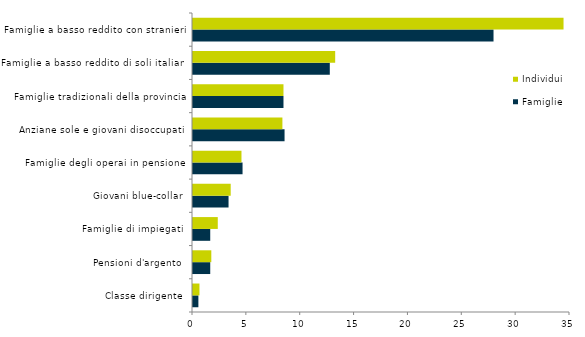
| Category | Famiglie | Individui |
|---|---|---|
| Classe dirigente | 0.5 | 0.6 |
| Pensioni d'argento | 1.6 | 1.7 |
| Famiglie di impiegati | 1.6 | 2.3 |
| Giovani blue-collar | 3.3 | 3.5 |
| Famiglie degli operai in pensione | 4.6 | 4.5 |
| Anziane sole e giovani disoccupati | 8.5 | 8.3 |
| Famiglie tradizionali della provincia | 8.4 | 8.4 |
| Famiglie a basso reddito di soli italiani | 12.7 | 13.2 |
| Famiglie a basso reddito con stranieri | 27.9 | 34.4 |